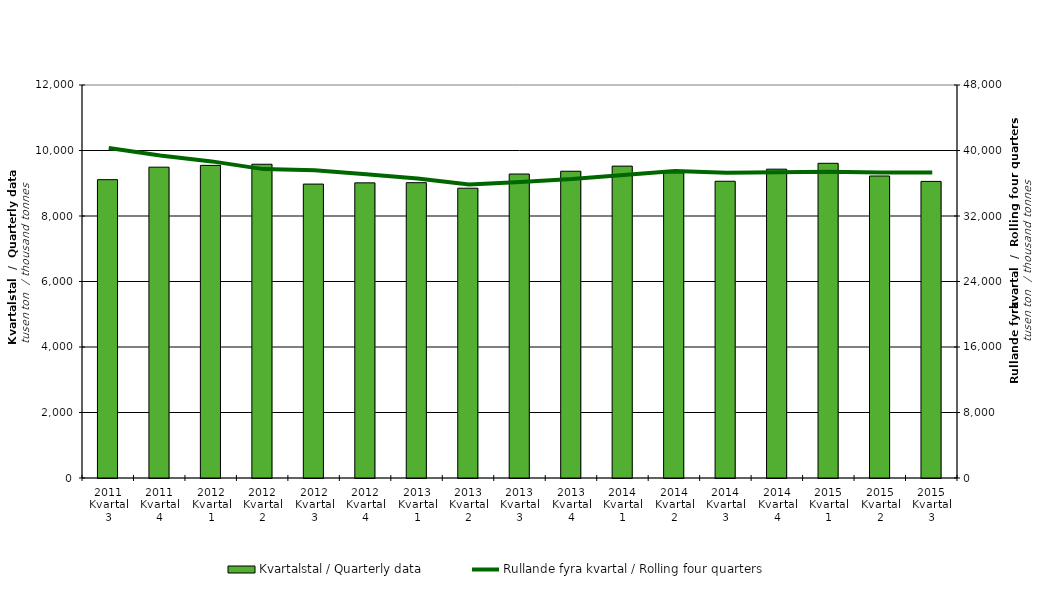
| Category | Kvartalstal / Quarterly data |
|---|---|
| 2011 Kvartal 3 | 9109.326 |
| 2011 Kvartal 4 | 9490.486 |
| 2012 Kvartal 1 | 9546.152 |
| 2012 Kvartal 2 | 9580.194 |
| 2012 Kvartal 3 | 8974.501 |
| 2012 Kvartal 4 | 9012.201 |
| 2013 Kvartal 1 | 9017.274 |
| 2013 Kvartal 2 | 8848.116 |
| 2013 Kvartal 3 | 9281.962 |
| 2013 Kvartal 4 | 9366.582 |
| 2014 Kvartal 1 | 9522.959 |
| 2014 Kvartal 2 | 9317.252 |
| 2014 Kvartal 3 | 9061.085 |
| 2014 Kvartal 4 | 9429.997 |
| 2015 Kvartal 1 | 9609.146 |
| 2015 Kvartal 2 | 9221.734 |
| 2015 Kvartal 3 | 9056.581 |